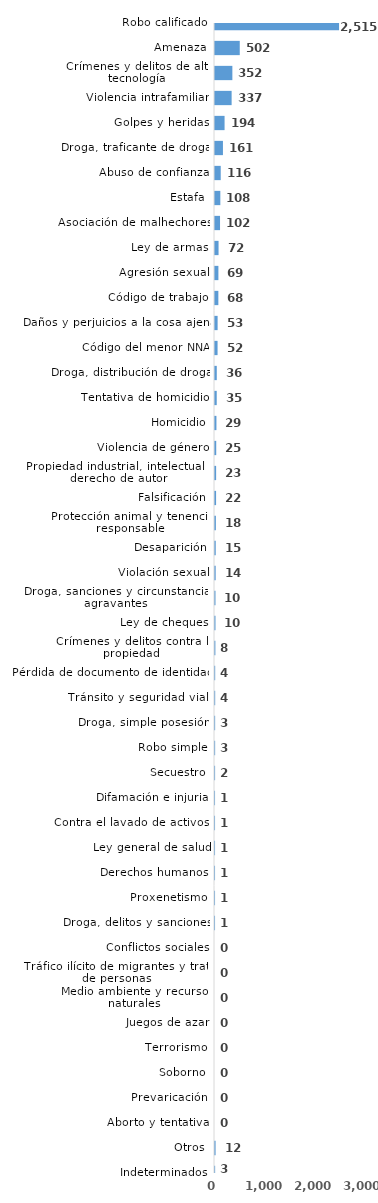
| Category | Series 0 |
|---|---|
| Robo calificado | 2515 |
| Amenaza | 502 |
| Crímenes y delitos de alta tecnología | 352 |
| Violencia intrafamiliar | 337 |
| Golpes y heridas | 194 |
| Droga, traficante de droga | 161 |
| Abuso de confianza | 116 |
| Estafa | 108 |
| Asociación de malhechores | 102 |
| Ley de armas | 72 |
| Agresión sexual | 69 |
| Código de trabajo | 68 |
| Daños y perjuicios a la cosa ajena | 53 |
| Código del menor NNA | 52 |
| Droga, distribución de droga | 36 |
| Tentativa de homicidio | 35 |
| Homicidio | 29 |
| Violencia de género | 25 |
| Propiedad industrial, intelectual y derecho de autor | 23 |
| Falsificación | 22 |
| Protección animal y tenencia responsable | 18 |
| Desaparición | 15 |
| Violación sexual | 14 |
| Droga, sanciones y circunstancias agravantes | 10 |
| Ley de cheques | 10 |
| Crímenes y delitos contra la propiedad | 8 |
| Pérdida de documento de identidad | 4 |
| Tránsito y seguridad vial  | 4 |
| Droga, simple posesión | 3 |
| Robo simple | 3 |
| Secuestro | 2 |
| Difamación e injuria | 1 |
| Contra el lavado de activos  | 1 |
| Ley general de salud | 1 |
| Derechos humanos | 1 |
| Proxenetismo | 1 |
| Droga, delitos y sanciones | 1 |
| Conflictos sociales | 0 |
| Tráfico ilícito de migrantes y trata de personas | 0 |
| Medio ambiente y recursos naturales | 0 |
| Juegos de azar | 0 |
| Terrorismo | 0 |
| Soborno | 0 |
| Prevaricación | 0 |
| Aborto y tentativa | 0 |
| Otros | 12 |
| Indeterminados | 3 |